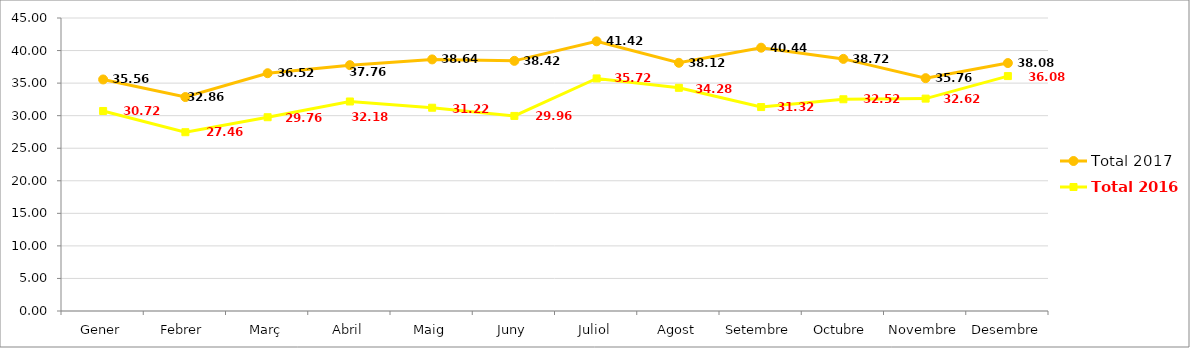
| Category | Total 2017 | Total 2016 |
|---|---|---|
| Gener | 35.56 | 30.72 |
| Febrer | 32.86 | 27.46 |
| Març | 36.52 | 29.76 |
| Abril | 37.76 | 32.18 |
| Maig | 38.64 | 31.22 |
| Juny | 38.42 | 29.96 |
| Juliol | 41.42 | 35.72 |
| Agost | 38.12 | 34.28 |
| Setembre | 40.44 | 31.32 |
| Octubre | 38.72 | 32.52 |
| Novembre | 35.76 | 32.619 |
| Desembre | 38.08 | 36.08 |